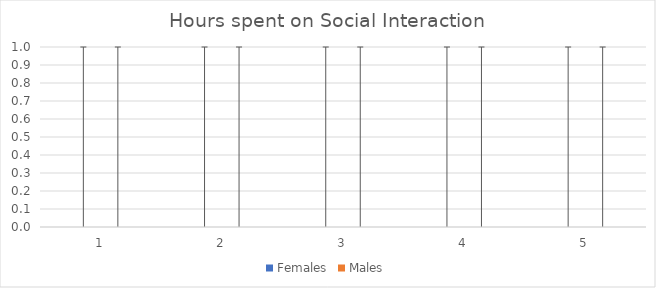
| Category | Females | Males |
|---|---|---|
| 0 | 0 | 0 |
| 1 | 0 | 0 |
| 2 | 0 | 0 |
| 3 | 0 | 0 |
| 4 | 0 | 0 |